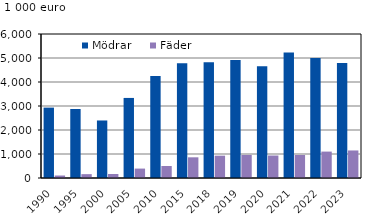
| Category | Mödrar | Fäder |
|---|---|---|
| 1990.0 | 2932.525 | 103.436 |
| 1995.0 | 2875.509 | 160.451 |
| 2000.0 | 2397 | 167 |
| 2005.0 | 3336 | 392 |
| 2010.0 | 4254.734 | 500.514 |
| 2015.0 | 4777.482 | 861.95 |
| 2018.0 | 4823.949 | 930.135 |
| 2019.0 | 4913.973 | 960.417 |
| 2020.0 | 4654.93 | 936.486 |
| 2021.0 | 5230 | 958 |
| 2022.0 | 5001.356 | 1100.397 |
| 2023.0 | 4795.883 | 1147.482 |